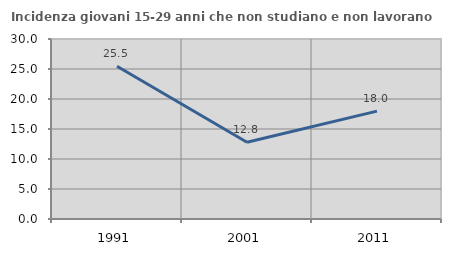
| Category | Incidenza giovani 15-29 anni che non studiano e non lavorano  |
|---|---|
| 1991.0 | 25.471 |
| 2001.0 | 12.799 |
| 2011.0 | 17.975 |